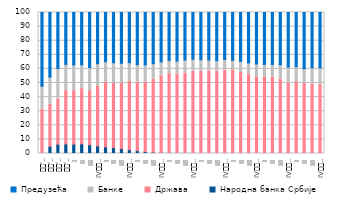
| Category | Народна банка Србије | Држава | Банке | Предузећа |
|---|---|---|---|---|
| 
'08. | 0 | 31.291 | 16.447 | 52.262 |
| 
'09. | 4.984 | 29.887 | 19.325 | 45.804 |
| 
'10. | 6.503 | 32.179 | 21.652 | 39.665 |
| 
'11. | 6.706 | 38.066 | 18.448 | 36.78 |
| I | 6.602 | 37.888 | 18.27 | 37.24 |
| II | 6.814 | 39.174 | 16.883 | 37.129 |
| III | 6.204 | 38.335 | 16.474 | 38.987 |
| IV
2012. | 5.415 | 42.098 | 16.181 | 36.306 |
| I | 4.685 | 46.019 | 14.432 | 34.864 |
| II | 4.172 | 45.685 | 14.545 | 35.598 |
| III | 3.477 | 46.517 | 14.026 | 35.98 |
| IV
2013. | 2.719 | 48.441 | 13.222 | 35.619 |
| I | 2.021 | 48.661 | 12.328 | 36.99 |
| II | 1.323 | 49.383 | 12.132 | 37.162 |
| III | 0.944 | 51.893 | 10.911 | 36.253 |
| IV
2014. | 0.591 | 54.493 | 9.967 | 34.949 |
| I | 0.407 | 56.273 | 9.408 | 33.912 |
| II | 0.194 | 56.26 | 9.127 | 34.418 |
| III | 0.112 | 56.908 | 9.265 | 33.715 |
| IV
2015. | 0.056 | 58.247 | 8.549 | 33.148 |
| I | 0.028 | 58.122 | 8.368 | 33.482 |
| II | 0 | 58.669 | 7.611 | 33.72 |
| III | 0 | 58.285 | 7.49 | 34.225 |
| IV
2016. | 0 | 59.181 | 7.541 | 33.278 |
| I | 0 | 59.435 | 6.62 | 33.944 |
| II | 0 | 57.473 | 7.843 | 34.684 |
| III | 0 | 56.361 | 7.899 | 35.74 |
| IV
2017. | 0 | 54.384 | 9.131 | 36.485 |
| I | 0 | 54.218 | 8.929 | 36.854 |
| II | 0 | 54.004 | 9.148 | 36.848 |
| III | 0 | 52.771 | 10.203 | 37.027 |
| IV
2018. | 0 | 49.898 | 11.402 | 38.699 |
| I | 0 | 51.033 | 10.471 | 38.496 |
| II | 0 | 49.827 | 10.292 | 39.881 |
| III | 0 | 49.289 | 11.631 | 39.081 |
| IV
2019. | 0 | 48.79 | 12.001 | 39.209 |